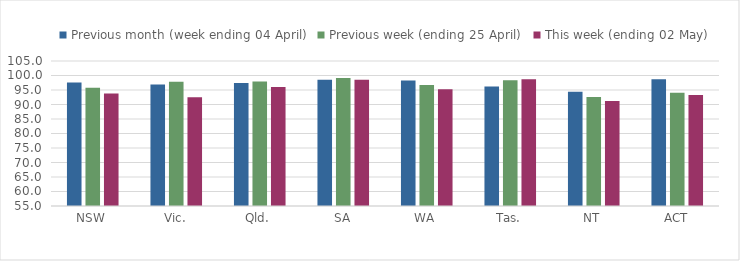
| Category | Previous month (week ending 04 April) | Previous week (ending 25 April) | This week (ending 02 May) |
|---|---|---|---|
| NSW | 97.61 | 95.75 | 93.827 |
| Vic. | 96.902 | 97.886 | 92.539 |
| Qld. | 97.432 | 97.932 | 95.993 |
| SA | 98.51 | 99.157 | 98.55 |
| WA | 98.243 | 96.733 | 95.283 |
| Tas. | 96.18 | 98.383 | 98.702 |
| NT | 94.361 | 92.55 | 91.186 |
| ACT | 98.689 | 94.011 | 93.3 |